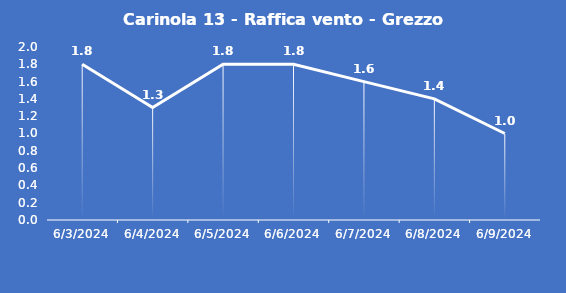
| Category | Carinola 13 - Raffica vento - Grezzo (m/s) |
|---|---|
| 6/3/24 | 1.8 |
| 6/4/24 | 1.3 |
| 6/5/24 | 1.8 |
| 6/6/24 | 1.8 |
| 6/7/24 | 1.6 |
| 6/8/24 | 1.4 |
| 6/9/24 | 1 |